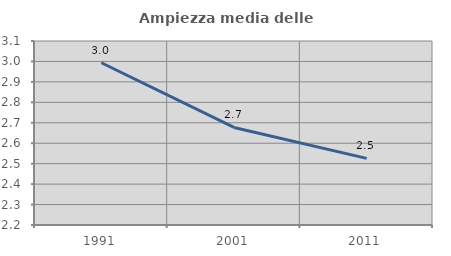
| Category | Ampiezza media delle famiglie |
|---|---|
| 1991.0 | 2.994 |
| 2001.0 | 2.677 |
| 2011.0 | 2.526 |